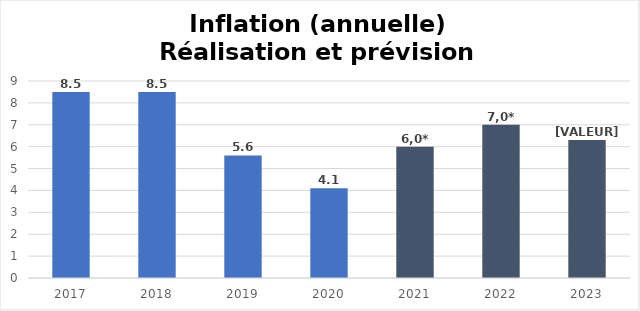
| Category |  Inflation  |
|---|---|
| 2017.0 | 8.5 |
| 2018.0 | 8.5 |
| 2019.0 | 5.6 |
| 2020.0 | 4.1 |
| 2021.0 | 6 |
| 2022.0 | 7 |
| 2023.0 | 6.3 |